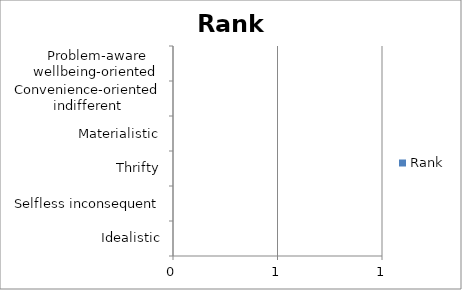
| Category | Rank |
|---|---|
| Idealistic | 0 |
| Selfless inconsequent | 0 |
| Thrifty | 0 |
| Materialistic | 0 |
| Convenience-oriented indifferent | 0 |
| Problem-aware wellbeing-oriented  | 0 |